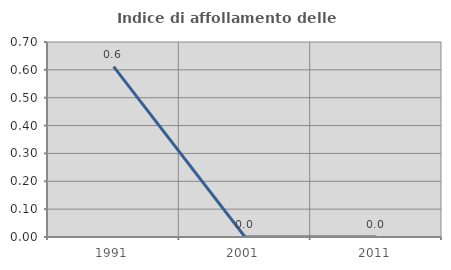
| Category | Indice di affollamento delle abitazioni  |
|---|---|
| 1991.0 | 0.612 |
| 2001.0 | 0 |
| 2011.0 | 0 |